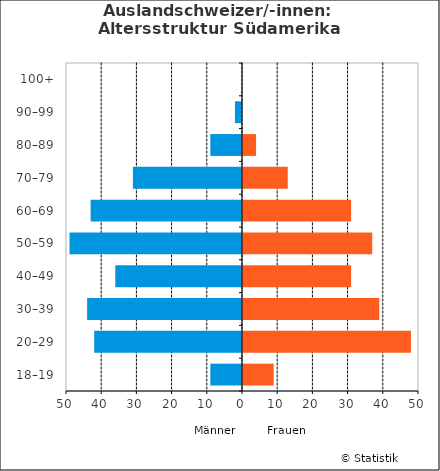
| Category | Männer | Frauen |
|---|---|---|
| 18–19 | -9 | 9 |
| 20–29 | -42 | 48 |
| 30–39 | -44 | 39 |
| 40–49 | -36 | 31 |
| 50–59 | -49 | 37 |
| 60–69 | -43 | 31 |
| 70–79 | -31 | 13 |
| 80–89 | -9 | 4 |
| 90–99 | -2 | 0 |
| 100+ | 0 | 0 |